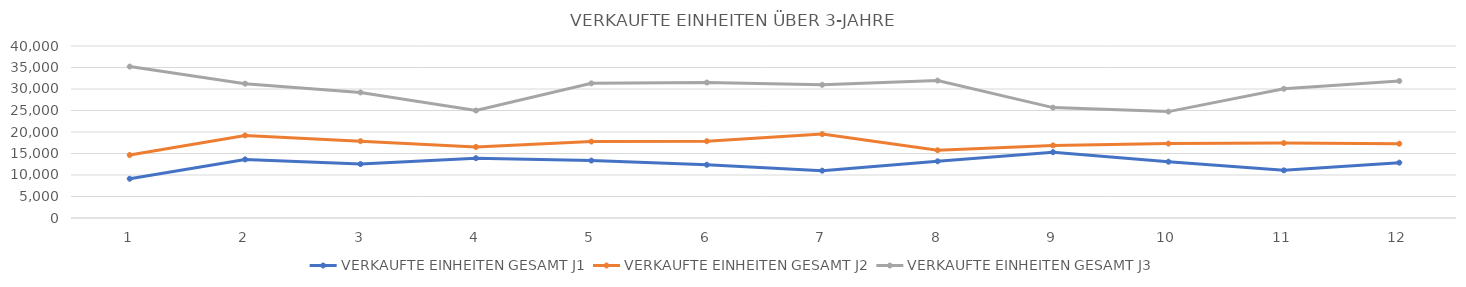
| Category | VERKAUFTE EINHEITEN GESAMT J1 | VERKAUFTE EINHEITEN GESAMT J2 | VERKAUFTE EINHEITEN GESAMT J3 |
|---|---|---|---|
| 0 | 9129 | 14647 | 35215 |
| 1 | 13628 | 19204 | 31243 |
| 2 | 12539 | 17864 | 29198 |
| 3 | 13910 | 16530 | 24992 |
| 4 | 13356 | 17775 | 31314 |
| 5 | 12381 | 17858 | 31508 |
| 6 | 11005 | 19508 | 30973 |
| 7 | 13184 | 15750 | 31959 |
| 8 | 15306 | 16882 | 25671 |
| 9 | 13088 | 17301 | 24743 |
| 10 | 11079 | 17423 | 30043 |
| 11 | 12870 | 17275 | 31855 |